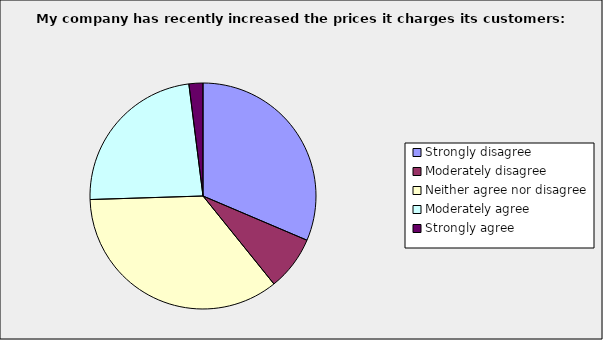
| Category | Series 0 |
|---|---|
| Strongly disagree | 0.314 |
| Moderately disagree | 0.078 |
| Neither agree nor disagree | 0.353 |
| Moderately agree | 0.235 |
| Strongly agree | 0.02 |